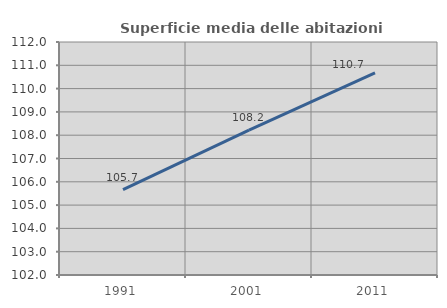
| Category | Superficie media delle abitazioni occupate |
|---|---|
| 1991.0 | 105.666 |
| 2001.0 | 108.221 |
| 2011.0 | 110.68 |